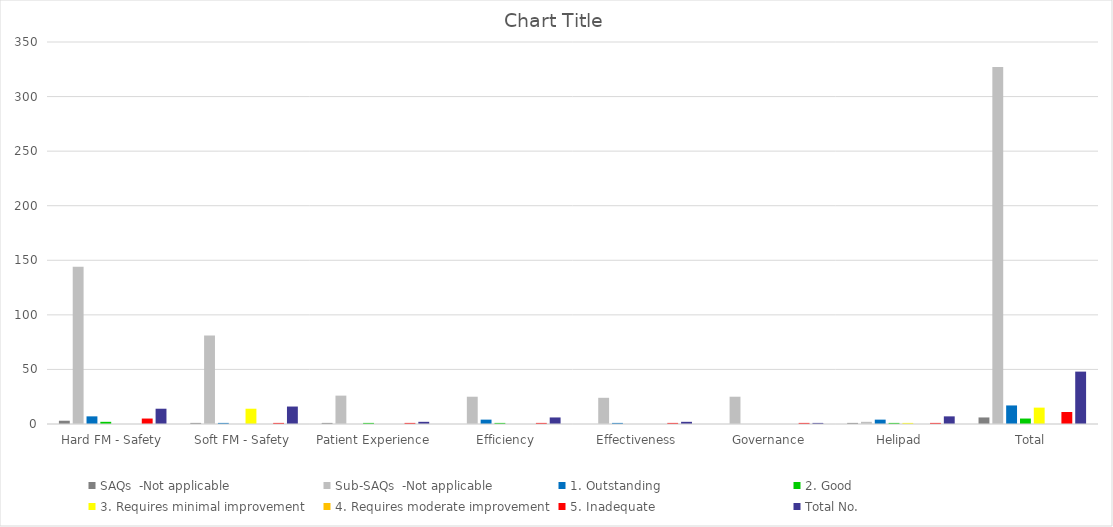
| Category | SAQs  -Not applicable | Sub-SAQs  -Not applicable | 1. Outstanding | 2. Good | 3. Requires minimal improvement | 4. Requires moderate improvement | 5. Inadequate | Total No. |
|---|---|---|---|---|---|---|---|---|
| Hard FM - Safety | 3 | 144 | 7 | 2 | 0 | 0 | 5 | 14 |
| Soft FM - Safety | 1 | 81 | 1 | 0 | 14 | 0 | 1 | 16 |
| Patient Experience | 1 | 26 | 0 | 1 | 0 | 0 | 1 | 2 |
| Efficiency | 0 | 25 | 4 | 1 | 0 | 0 | 1 | 6 |
| Effectiveness | 0 | 24 | 1 | 0 | 0 | 0 | 1 | 2 |
| Governance | 0 | 25 | 0 | 0 | 0 | 0 | 1 | 1 |
| Helipad | 1 | 2 | 4 | 1 | 1 | 0 | 1 | 7 |
| Total | 6 | 327 | 17 | 5 | 15 | 0 | 11 | 48 |